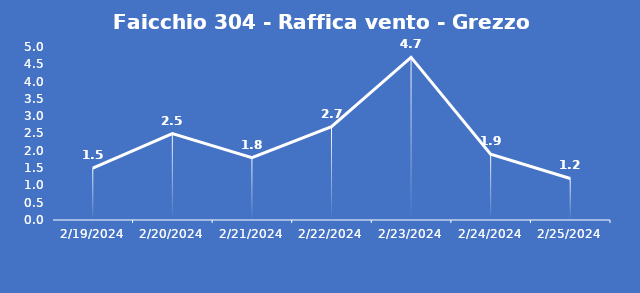
| Category | Faicchio 304 - Raffica vento - Grezzo (m/s) |
|---|---|
| 2/19/24 | 1.5 |
| 2/20/24 | 2.5 |
| 2/21/24 | 1.8 |
| 2/22/24 | 2.7 |
| 2/23/24 | 4.7 |
| 2/24/24 | 1.9 |
| 2/25/24 | 1.2 |